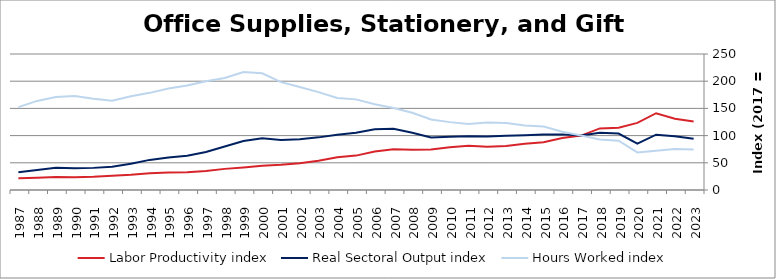
| Category | Labor Productivity index | Real Sectoral Output index | Hours Worked index |
|---|---|---|---|
| 2023.0 | 126.112 | 94.023 | 74.556 |
| 2022.0 | 130.994 | 98.753 | 75.387 |
| 2021.0 | 141.116 | 101.688 | 72.06 |
| 2020.0 | 123.329 | 85.116 | 69.015 |
| 2019.0 | 114.546 | 103.832 | 90.647 |
| 2018.0 | 113.216 | 105.097 | 92.829 |
| 2017.0 | 100 | 100 | 100 |
| 2016.0 | 95.402 | 102.248 | 107.176 |
| 2015.0 | 87.742 | 102.23 | 116.512 |
| 2014.0 | 85.194 | 100.864 | 118.394 |
| 2013.0 | 80.837 | 99.729 | 123.37 |
| 2012.0 | 79.315 | 98.306 | 123.944 |
| 2011.0 | 81.409 | 98.762 | 121.316 |
| 2010.0 | 78.516 | 97.969 | 124.777 |
| 2009.0 | 74.477 | 96.575 | 129.672 |
| 2008.0 | 74.042 | 105.226 | 142.116 |
| 2007.0 | 74.734 | 112.73 | 150.842 |
| 2006.0 | 70.941 | 111.76 | 157.539 |
| 2005.0 | 63.214 | 105.31 | 166.593 |
| 2004.0 | 60.125 | 101.687 | 169.127 |
| 2003.0 | 53.779 | 96.749 | 179.902 |
| 2002.0 | 49.362 | 93.496 | 189.408 |
| 2001.0 | 46.437 | 92.084 | 198.299 |
| 2000.0 | 44.388 | 95.248 | 214.579 |
| 1999.0 | 41.519 | 89.978 | 216.712 |
| 1998.0 | 38.832 | 80.015 | 206.053 |
| 1997.0 | 34.915 | 69.857 | 200.081 |
| 1996.0 | 32.709 | 62.879 | 192.236 |
| 1995.0 | 32.02 | 59.793 | 186.741 |
| 1994.0 | 30.993 | 55.346 | 178.574 |
| 1993.0 | 27.885 | 48.084 | 172.438 |
| 1992.0 | 26.032 | 42.752 | 164.232 |
| 1991.0 | 24.248 | 40.671 | 167.727 |
| 1990.0 | 23.249 | 40.207 | 172.942 |
| 1989.0 | 23.826 | 40.734 | 170.968 |
| 1988.0 | 22.415 | 36.705 | 163.752 |
| 1987.0 | 21.41 | 32.635 | 152.428 |